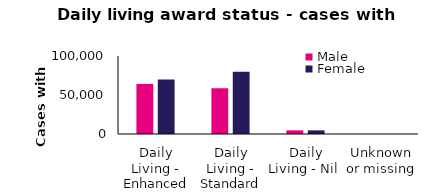
| Category | Male | Female |
|---|---|---|
| Daily Living - Enhanced | 64139 | 69782 |
| Daily Living - Standard | 58644 | 79861 |
| Daily Living - Nil  | 4693 | 4647 |
| Unknown or missing | 9 | 8 |